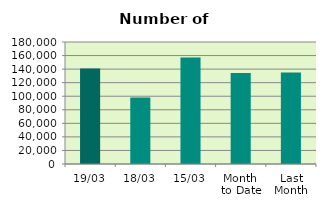
| Category | Series 0 |
|---|---|
| 19/03 | 140932 |
| 18/03 | 98200 |
| 15/03 | 157128 |
| Month 
to Date | 134317.077 |
| Last
Month | 135041.7 |